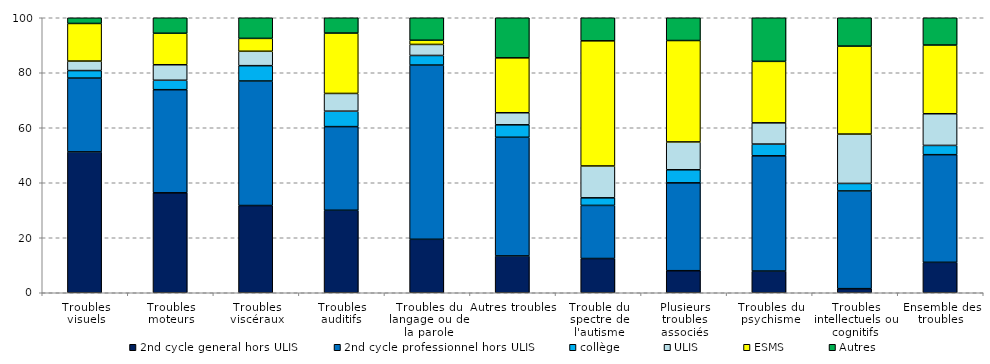
| Category | 2nd cycle general hors ULIS | 2nd cycle professionnel hors ULIS | collège | ULIS | ESMS | Autres |
|---|---|---|---|---|---|---|
| Troubles visuels | 51.218 | 26.84 | 2.736 | 3.455 | 13.673 | 2.067 |
| Troubles moteurs | 36.341 | 37.495 | 3.436 | 5.637 | 11.452 | 5.639 |
| Troubles viscéraux | 31.718 | 45.28 | 5.58 | 5.229 | 4.692 | 7.501 |
| Troubles auditifs | 29.999 | 30.412 | 5.614 | 6.448 | 21.956 | 5.572 |
| Troubles du langage ou de la parole | 19.442 | 63.354 | 3.492 | 4.009 | 1.522 | 8.181 |
| Autres troubles | 13.387 | 43.158 | 4.527 | 4.389 | 19.963 | 14.577 |
| Trouble du spectre de l'autisme | 12.451 | 19.315 | 2.753 | 11.585 | 45.504 | 8.397 |
| Plusieurs troubles associés | 8.018 | 31.944 | 4.758 | 10.125 | 36.872 | 8.283 |
| Troubles du psychisme | 7.884 | 41.908 | 4.275 | 7.721 | 22.359 | 15.853 |
| Troubles intellectuels ou cognitifs | 1.484 | 35.529 | 2.742 | 17.946 | 31.992 | 10.303 |
| Ensemble des troubles | 11.067 | 39.142 | 3.365 | 11.519 | 24.986 | 9.919 |